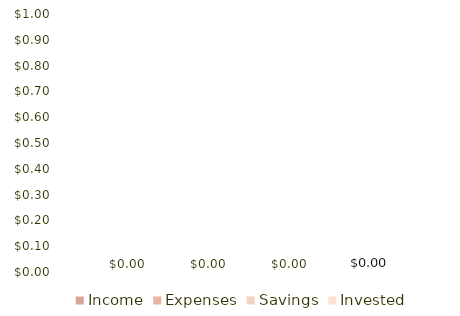
| Category | Income | Expenses | Savings | Invested |
|---|---|---|---|---|
| 0 | 0 | 0 | 0 | 0 |